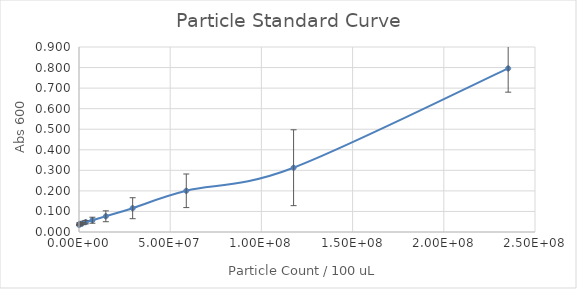
| Category | Series 0 |
|---|---|
| 235294117.64705887 | 0.796 |
| 117647058.82352944 | 0.313 |
| 58823529.41176472 | 0.2 |
| 29411764.70588236 | 0.116 |
| 14705882.35294118 | 0.076 |
| 7352941.17647059 | 0.057 |
| 3676470.588235295 | 0.048 |
| 1838235.2941176475 | 0.042 |
| 919117.6470588237 | 0.039 |
| 459558.82352941186 | 0.038 |
| 229779.41176470593 | 0.039 |
| 0.0 | 0.034 |